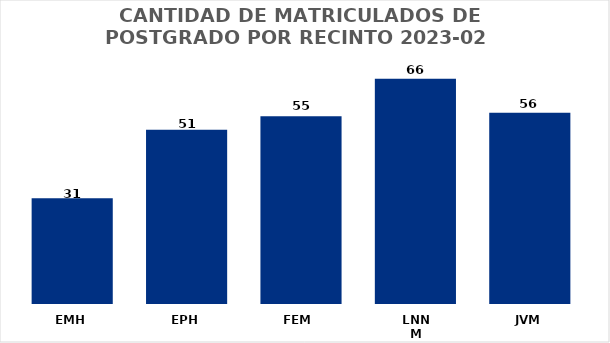
| Category | Series 0 |
|---|---|
| EMH | 31 |
| EPH | 51 |
| FEM  | 55 |
| LNNM | 66 |
| JVM | 56 |